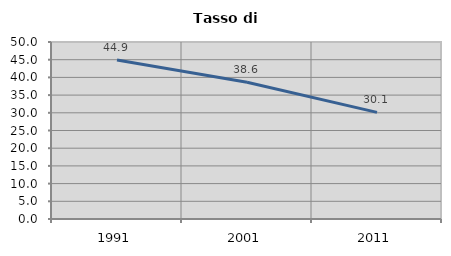
| Category | Tasso di disoccupazione   |
|---|---|
| 1991.0 | 44.928 |
| 2001.0 | 38.626 |
| 2011.0 | 30.122 |